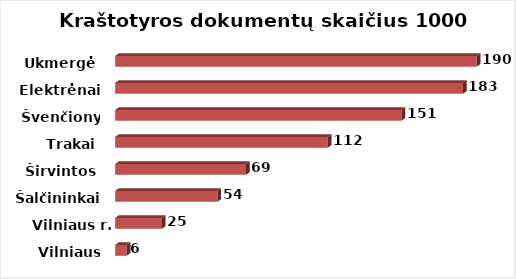
| Category | Series 0 |
|---|---|
| Vilniaus m. | 6.103 |
| Vilniaus r. | 24.594 |
| Šalčininkai | 53.865 |
| Širvintos | 68.936 |
| Trakai | 111.982 |
| Švenčionys | 150.813 |
| Elektrėnai | 183.205 |
| Ukmergė | 190.431 |